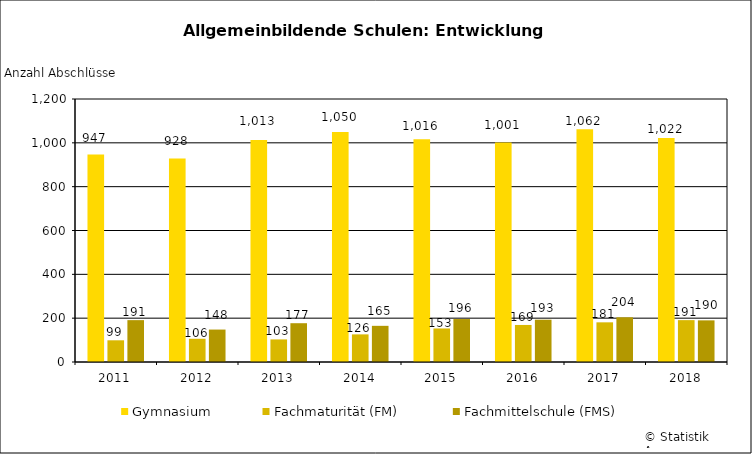
| Category | Gymnasium | Fachmaturität (FM) | Fachmittelschule (FMS) |
|---|---|---|---|
| 2011 | 947 | 99 | 191 |
| 2012 | 928 | 106 | 148 |
| 2013 | 1013 | 103 | 177 |
| 2014 | 1050 | 126 | 165 |
| 2015 | 1016 | 153 | 196 |
| 2016 | 1001 | 169 | 193 |
| 2017 | 1062 | 181 | 204 |
| 2018 | 1022 | 191 | 190 |